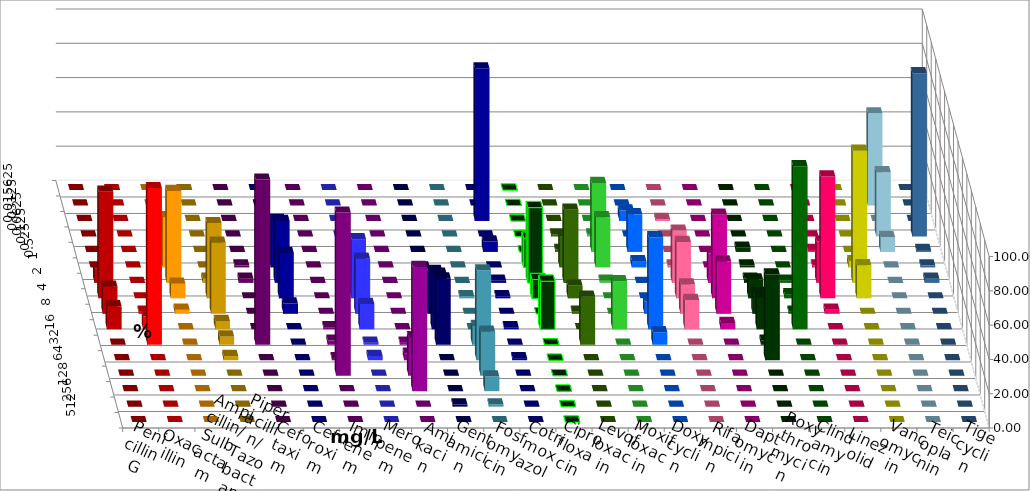
| Category | Penicillin G | Oxacillin | Ampicillin/ Sulbactam | Piperacillin/ Tazobactam | Cefotaxim | Cefuroxim | Imipenem | Meropenem | Amikacin | Gentamicin | Fosfomycin | Cotrimoxazol | Ciprofloxacin | Levofloxacin | Moxifloxacin | Doxycyclin | Rifampicin | Daptomycin | Roxythromycin | Clindamycin | Linezolid | Vancomycin | Teicoplanin | Tigecyclin |
|---|---|---|---|---|---|---|---|---|---|---|---|---|---|---|---|---|---|---|---|---|---|---|---|---|
| 0.015625 | 0 | 0 | 0 | 0 | 0 | 0 | 0 | 0 | 0 | 0 | 0 | 0 | 0 | 0 | 0 | 0 | 0 | 0 | 0 | 0 | 0 | 0 | 0 | 0 |
| 0.03125 | 0 | 0 | 0 | 0 | 0 | 0 | 0 | 0 | 0 | 0 | 0 | 0 | 0 | 0 | 0 | 0 | 0 | 0 | 0 | 0 | 0 | 0 | 0 | 53.75 |
| 0.0625 | 0 | 0 | 0 | 0 | 0 | 0 | 0 | 0 | 0 | 0 | 0 | 89.024 | 0 | 0 | 0 | 6.098 | 1.22 | 0 | 0 | 0 | 0 | 0 | 0 | 0 |
| 0.125 | 0 | 0 | 6.098 | 0 | 0 | 0 | 0 | 0 | 0 | 0 | 0 | 0 | 0 | 1.22 | 1.22 | 0 | 0 | 0 | 0 | 0 | 0 | 0 | 95.181 | 37.5 |
| 0.25 | 0 | 0 | 0 | 0 | 0 | 0 | 3.614 | 1.235 | 0 | 0 | 0 | 6.098 | 0 | 1.22 | 40.244 | 21.951 | 0 | 0 | 2.439 | 0 | 1.205 | 0 | 1.205 | 8.75 |
| 0.5 | 0 | 0 | 29.268 | 0 | 1.22 | 0 | 27.711 | 4.938 | 0 | 0 | 0 | 0 | 17.073 | 18.293 | 29.268 | 3.659 | 1.22 | 0 | 1.22 | 0 | 1.205 | 3.614 | 1.205 | 0 |
| 1.0 | 8.537 | 0 | 53.659 | 2.439 | 2.439 | 0 | 36.145 | 8.642 | 0 | 0 | 0 | 1.22 | 43.902 | 42.683 | 1.22 | 0 | 30.488 | 17.073 | 2.439 | 1.22 | 24.096 | 77.108 | 2.41 | 0 |
| 2.0 | 62.195 | 0 | 8.537 | 43.902 | 0 | 0 | 26.506 | 34.568 | 0 | 2.5 | 1.22 | 1.22 | 10.976 | 7.317 | 0 | 0 | 32.927 | 48.78 | 10.976 | 2.439 | 71.084 | 19.277 | 0 | 0 |
| 4.0 | 15.854 | 1.235 | 2.439 | 41.463 | 0 | 0 | 6.024 | 32.099 | 0 | 25 | 0 | 0 | 0 | 1.22 | 0 | 7.317 | 17.073 | 30.488 | 12.195 | 1.22 | 2.41 | 0 | 0 | 0 |
| 8.0 | 13.415 | 7.407 | 0 | 4.878 | 0 | 1.22 | 0 | 14.815 | 0 | 32.5 | 0 | 1.22 | 28.049 | 0 | 28.049 | 53.659 | 17.073 | 3.659 | 18.293 | 95.122 | 0 | 0 | 0 | 0 |
| 16.0 | 0 | 91.358 | 0 | 4.878 | 96.341 | 2.439 | 0 | 1.235 | 1.25 | 38.75 | 10.976 | 0 | 0 | 28.049 | 0 | 7.317 | 0 | 0 | 2.439 | 0 | 0 | 0 | 0 | 0 |
| 32.0 | 0 | 0 | 0 | 2.439 | 0 | 1.22 | 0 | 2.469 | 3.75 | 0 | 52.439 | 1.22 | 0 | 0 | 0 | 0 | 0 | 0 | 50 | 0 | 0 | 0 | 0 | 0 |
| 64.0 | 0 | 0 | 0 | 0 | 0 | 95.122 | 0 | 0 | 22.5 | 0 | 25.61 | 0 | 0 | 0 | 0 | 0 | 0 | 0 | 0 | 0 | 0 | 0 | 0 | 0 |
| 128.0 | 0 | 0 | 0 | 0 | 0 | 0 | 0 | 0 | 72.5 | 0 | 8.537 | 0 | 0 | 0 | 0 | 0 | 0 | 0 | 0 | 0 | 0 | 0 | 0 | 0 |
| 256.0 | 0 | 0 | 0 | 0 | 0 | 0 | 0 | 0 | 0 | 1.25 | 1.22 | 0 | 0 | 0 | 0 | 0 | 0 | 0 | 0 | 0 | 0 | 0 | 0 | 0 |
| 512.0 | 0 | 0 | 0 | 0 | 0 | 0 | 0 | 0 | 0 | 0 | 0 | 0 | 0 | 0 | 0 | 0 | 0 | 0 | 0 | 0 | 0 | 0 | 0 | 0 |